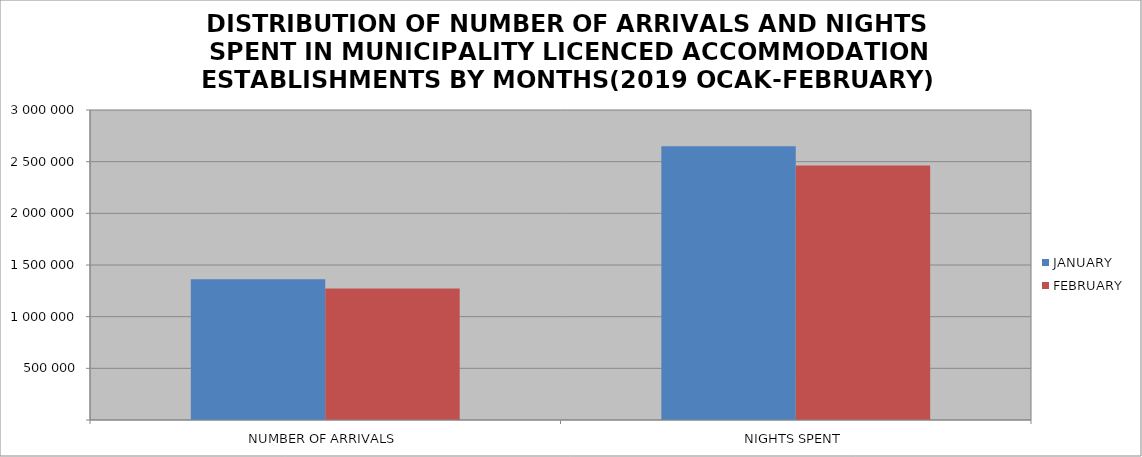
| Category | JANUARY | FEBRUARY |
|---|---|---|
| NUMBER OF ARRIVALS | 1363187 | 1273727 |
| NIGHTS SPENT | 2649437 | 2462023 |